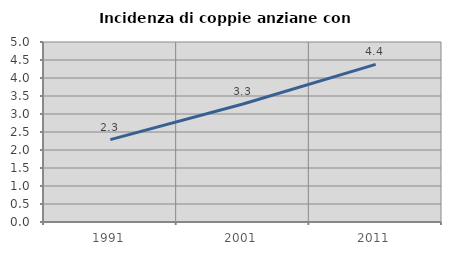
| Category | Incidenza di coppie anziane con figli |
|---|---|
| 1991.0 | 2.289 |
| 2001.0 | 3.279 |
| 2011.0 | 4.38 |